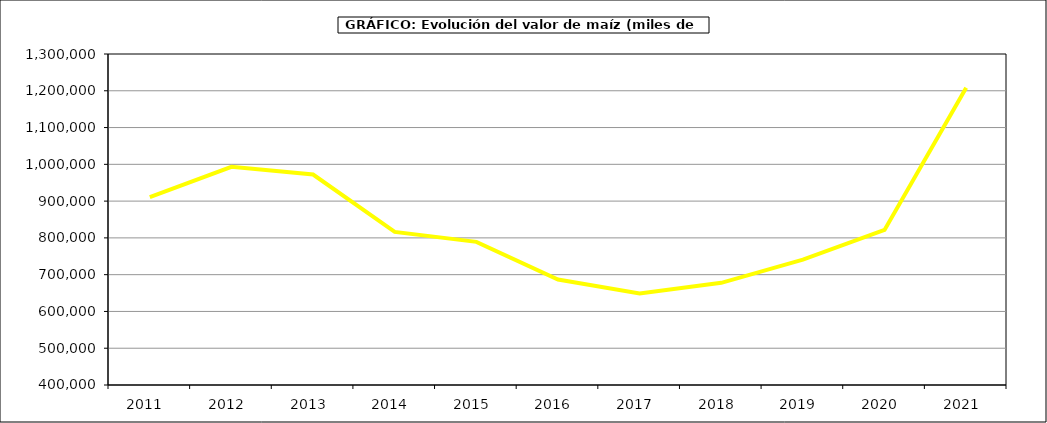
| Category | Valor |
|---|---|
| 2011.0 | 910964.166 |
| 2012.0 | 993073.028 |
| 2013.0 | 972315.092 |
| 2014.0 | 816366 |
| 2015.0 | 789188 |
| 2016.0 | 686933 |
| 2017.0 | 648655.811 |
| 2018.0 | 677820.352 |
| 2019.0 | 741067.689 |
| 2020.0 | 821749.89 |
| 2021.0 | 1208264.522 |